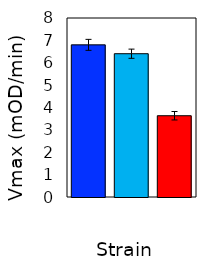
| Category | Series 0 |
|---|---|
| 0 | 6.8 |
| 1 | 6.404 |
| 2 | 3.632 |